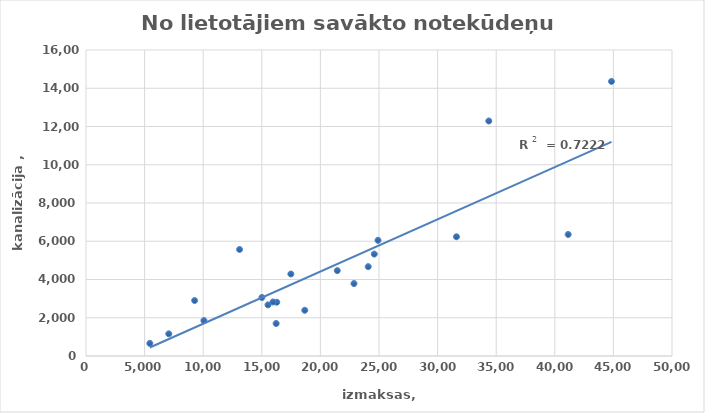
| Category | No lietotājiem savākto notekūdeņu apjoms  m3 |
|---|---|
| 9267.0 | 2901 |
| 16275.0 | 2812 |
| 44838.0 | 14357 |
| 21440.0 | 4464 |
| 10061.0 | 1852 |
| 41142.0 | 6355 |
| 15955.0 | 2824 |
| 16224.0 | 1700 |
| 5447.0 | 660 |
| 34368.0 | 12289 |
| 24598.0 | 5330 |
| 24916.0 | 6048 |
| 22865.0 | 3788.002 |
| 18667.0 | 2391 |
| 31611.0 | 6235.548 |
| 17481.0 | 4288 |
| 7063.0 | 1160 |
| 13103.0 | 5571.563 |
| 15009.0 | 3059 |
| 15529.0 | 2673 |
| 24079.0 | 4672.021 |